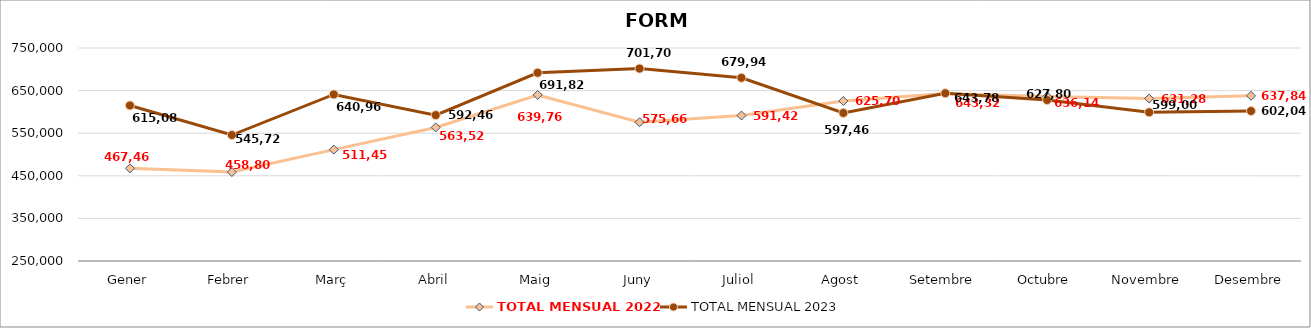
| Category | TOTAL MENSUAL 2022 | TOTAL MENSUAL 2023 |
|---|---|---|
| Gener | 467460.01 | 615080 |
| Febrer | 458800 | 545720 |
| Març | 511459 | 640960 |
| Abril | 563520 | 592460 |
| Maig | 639760 | 691820 |
| Juny | 575660 | 701700 |
| Juliol | 591420 | 679940 |
| Agost | 625700 | 597460 |
| Setembre | 643320 | 643780 |
| Octubre | 636140 | 627800 |
| Novembre | 631280 | 599000 |
| Desembre | 637840 | 602039.99 |